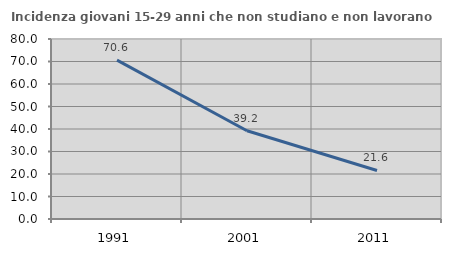
| Category | Incidenza giovani 15-29 anni che non studiano e non lavorano  |
|---|---|
| 1991.0 | 70.635 |
| 2001.0 | 39.199 |
| 2011.0 | 21.564 |